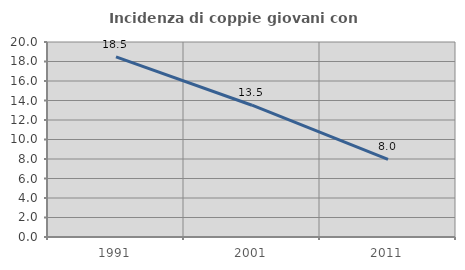
| Category | Incidenza di coppie giovani con figli |
|---|---|
| 1991.0 | 18.466 |
| 2001.0 | 13.517 |
| 2011.0 | 7.953 |